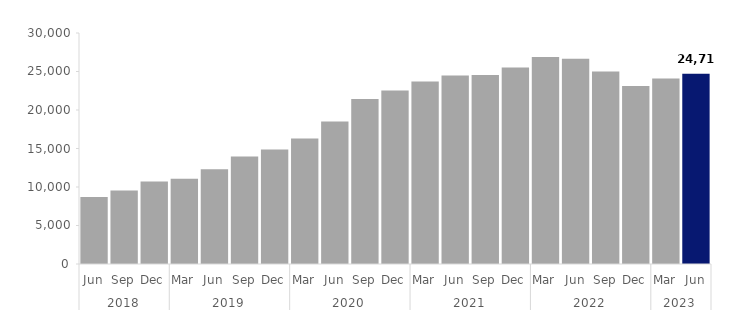
| Category | Series 0 |
|---|---|
| 0 | 8703 |
| 1 | 9537 |
| 2 | 10713 |
| 3 | 11067 |
| 4 | 12309 |
| 5 | 13965 |
| 6 | 14868 |
| 7 | 16308 |
| 8 | 18522 |
| 9 | 21414 |
| 10 | 22521 |
| 11 | 23688 |
| 12 | 24474 |
| 13 | 24546 |
| 14 | 25524 |
| 15 | 26868 |
| 16 | 26664 |
| 17 | 24996 |
| 18 | 23127 |
| 19 | 24081 |
| 20 | 24717 |